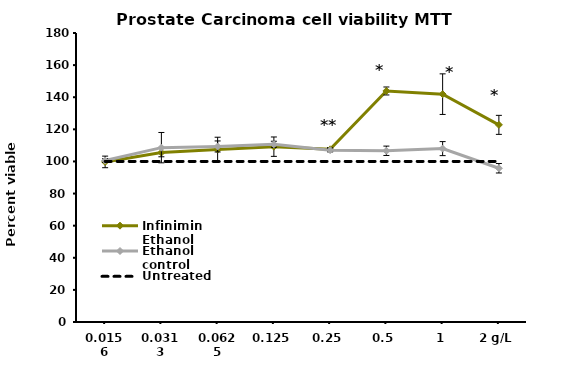
| Category | Infinimin Ethanol | Ethanol control | Untreated |
|---|---|---|---|
| 0.0156 | 99.708 | 100.562 | 100 |
| 0.0313 | 105.512 | 108.594 | 100 |
| 0.0625 | 107.447 | 109.336 | 100 |
| 0.125 | 109.201 | 110.686 | 100 |
| 0.25 | 107.537 | 107.042 | 100 |
| 0.5 | 143.892 | 106.637 | 100 |
| 1 | 141.912 | 107.987 | 100 |
| 2 g/L | 122.79 | 95.771 | 100 |